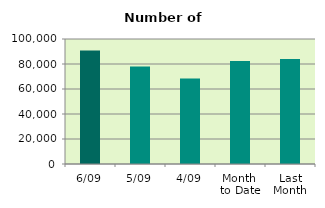
| Category | Series 0 |
|---|---|
| 6/09 | 90900 |
| 5/09 | 78070 |
| 4/09 | 68372 |
| Month 
to Date | 82485 |
| Last
Month | 83988.522 |